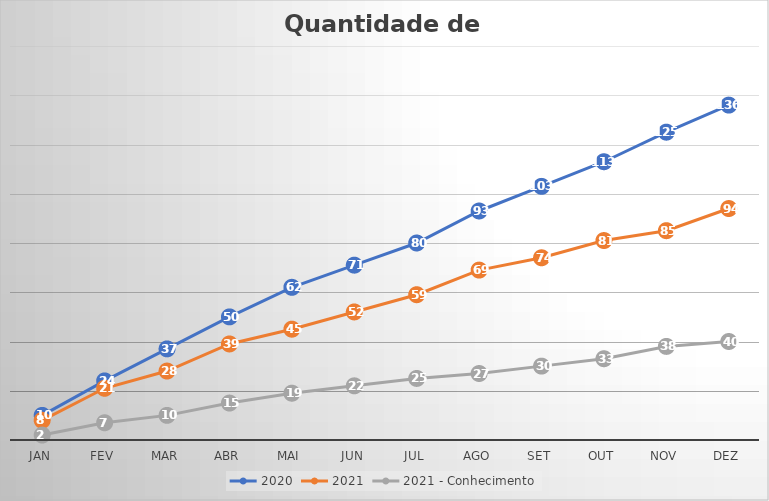
| Category | 2020 | 2021 | 2021 - Conhecimento |
|---|---|---|---|
| Jan | 10 | 8 | 2 |
| Fev | 24 | 21 | 7 |
| Mar | 37 | 28 | 10 |
| Abr | 50 | 39 | 15 |
| Mai | 62 | 45 | 19 |
| Jun | 71 | 52 | 22 |
| Jul | 80 | 59 | 25 |
| Ago | 93 | 69 | 27 |
| Set | 103 | 74 | 30 |
| Out | 113 | 81 | 33 |
| Nov | 125 | 85 | 38 |
| Dez | 136 | 94 | 40 |